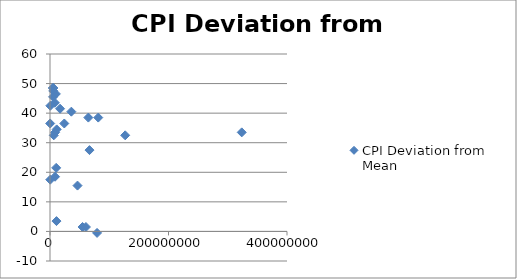
| Category | CPI Deviation from Mean |
|---|---|
| 24104700.0 | 36.5 |
| 8662588.0 | 33.5 |
| 11250585.0 | 34.5 |
| 36048521.0 | 40.5 |
| 5707251.0 | 48.5 |
| 5488543.0 | 47.5 |
| 66689000.0 | 27.5 |
| 81459000.0 | 38.5 |
| 10955000.0 | 3.5 |
| 332529.0 | 36.5 |
| 6378000.0 | 32.5 |
| 8502900.0 | 18.5 |
| 60674003.0 | 1.5 |
| 126919659.0 | 32.5 |
| 562958.0 | 42.5 |
| 445426.0 | 17.5 |
| 17000059.0 | 41.5 |
| 4691480.0 | 48.5 |
| 5214900.0 | 45.5 |
| 10427301.0 | 21.5 |
| 54956900.0 | 1.5 |
| 46423064.0 | 15.5 |
| 9875378.0 | 46.5 |
| 8211700.0 | 43.5 |
| 79463663.0 | -0.5 |
| 64716000.0 | 38.5 |
| 323625762.0 | 33.5 |